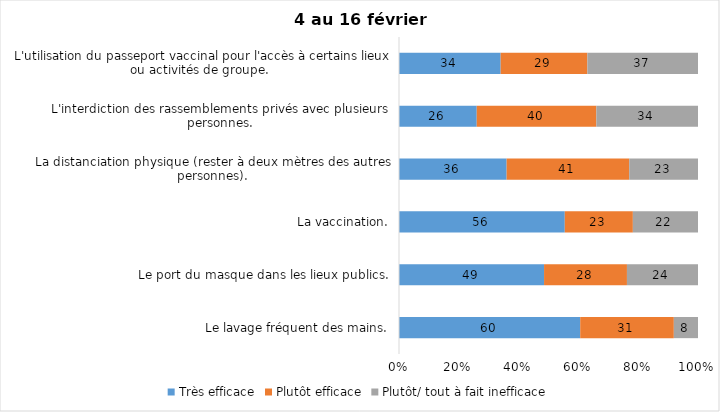
| Category | Très efficace | Plutôt efficace | Plutôt/ tout à fait inefficace |
|---|---|---|---|
| Le lavage fréquent des mains. | 60 | 31 | 8 |
| Le port du masque dans les lieux publics. | 49 | 28 | 24 |
| La vaccination. | 56 | 23 | 22 |
| La distanciation physique (rester à deux mètres des autres personnes). | 36 | 41 | 23 |
| L'interdiction des rassemblements privés avec plusieurs personnes. | 26 | 40 | 34 |
| L'utilisation du passeport vaccinal pour l'accès à certains lieux ou activités de groupe.  | 34 | 29 | 37 |